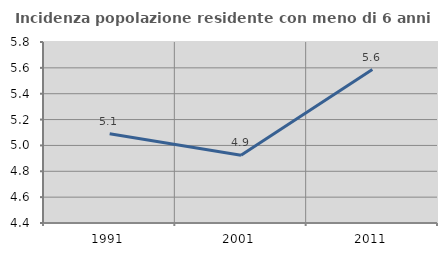
| Category | Incidenza popolazione residente con meno di 6 anni |
|---|---|
| 1991.0 | 5.091 |
| 2001.0 | 4.924 |
| 2011.0 | 5.587 |